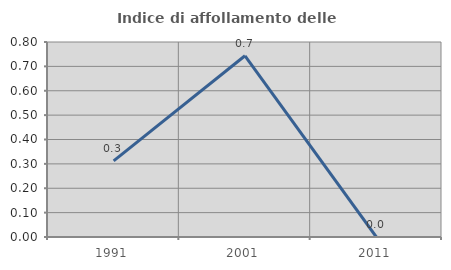
| Category | Indice di affollamento delle abitazioni  |
|---|---|
| 1991.0 | 0.312 |
| 2001.0 | 0.743 |
| 2011.0 | 0 |